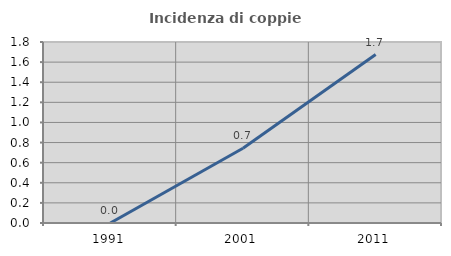
| Category | Incidenza di coppie miste |
|---|---|
| 1991.0 | 0 |
| 2001.0 | 0.744 |
| 2011.0 | 1.676 |